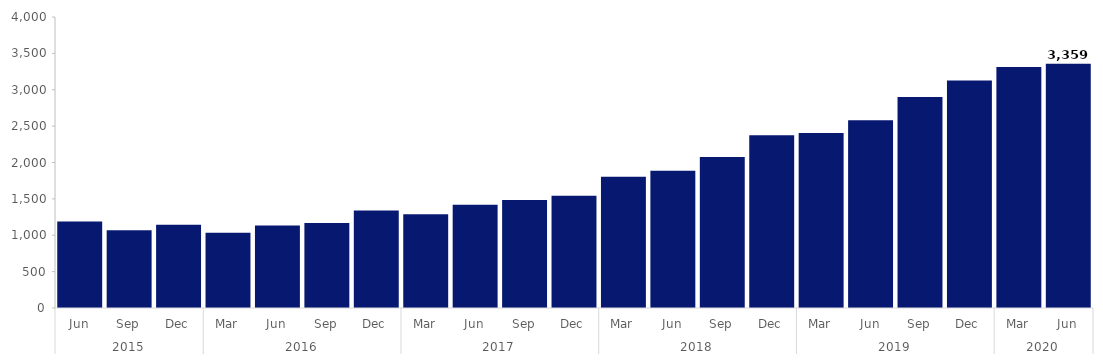
| Category | Series 0 |
|---|---|
| 0 | 1189 |
| 1 | 1068 |
| 2 | 1143 |
| 3 | 1036 |
| 4 | 1135 |
| 5 | 1168 |
| 6 | 1339 |
| 7 | 1289 |
| 8 | 1420 |
| 9 | 1483 |
| 10 | 1543 |
| 11 | 1805 |
| 12 | 1885 |
| 13 | 2076 |
| 14 | 2374 |
| 15 | 2407 |
| 16 | 2580 |
| 17 | 2901 |
| 18 | 3126 |
| 19 | 3312 |
| 20 | 3359 |